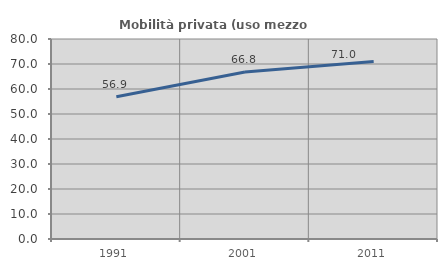
| Category | Mobilità privata (uso mezzo privato) |
|---|---|
| 1991.0 | 56.897 |
| 2001.0 | 66.825 |
| 2011.0 | 70.973 |